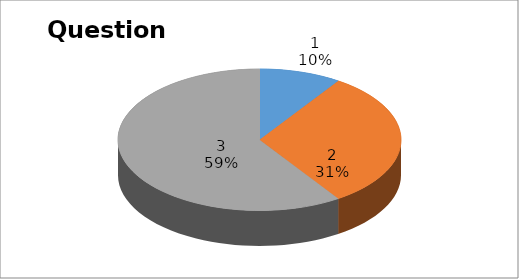
| Category | Series 0 |
|---|---|
| 0 | 3 |
| 1 | 10 |
| 2 | 19 |